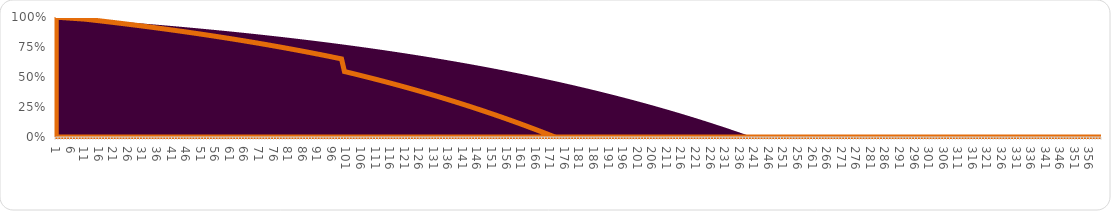
| Category | Original Loan | Effect of Extra Payments |
|---|---|---|
| 0 | 0.998 | 0.998 |
| 1 | 0.997 | 0.997 |
| 2 | 0.995 | 0.995 |
| 3 | 0.994 | 0.994 |
| 4 | 0.992 | 0.992 |
| 5 | 0.99 | 0.99 |
| 6 | 0.989 | 0.989 |
| 7 | 0.987 | 0.987 |
| 8 | 0.985 | 0.985 |
| 9 | 0.984 | 0.984 |
| 10 | 0.982 | 0.982 |
| 11 | 0.98 | 0.979 |
| 12 | 0.978 | 0.976 |
| 13 | 0.977 | 0.974 |
| 14 | 0.975 | 0.971 |
| 15 | 0.973 | 0.968 |
| 16 | 0.971 | 0.965 |
| 17 | 0.969 | 0.962 |
| 18 | 0.968 | 0.959 |
| 19 | 0.966 | 0.957 |
| 20 | 0.964 | 0.954 |
| 21 | 0.962 | 0.951 |
| 22 | 0.96 | 0.948 |
| 23 | 0.958 | 0.945 |
| 24 | 0.957 | 0.942 |
| 25 | 0.955 | 0.939 |
| 26 | 0.953 | 0.936 |
| 27 | 0.951 | 0.933 |
| 28 | 0.949 | 0.93 |
| 29 | 0.947 | 0.927 |
| 30 | 0.945 | 0.924 |
| 31 | 0.943 | 0.92 |
| 32 | 0.941 | 0.917 |
| 33 | 0.939 | 0.914 |
| 34 | 0.937 | 0.911 |
| 35 | 0.935 | 0.908 |
| 36 | 0.933 | 0.904 |
| 37 | 0.931 | 0.901 |
| 38 | 0.929 | 0.898 |
| 39 | 0.927 | 0.894 |
| 40 | 0.924 | 0.891 |
| 41 | 0.922 | 0.888 |
| 42 | 0.92 | 0.884 |
| 43 | 0.918 | 0.881 |
| 44 | 0.916 | 0.878 |
| 45 | 0.914 | 0.874 |
| 46 | 0.911 | 0.871 |
| 47 | 0.909 | 0.867 |
| 48 | 0.907 | 0.864 |
| 49 | 0.905 | 0.86 |
| 50 | 0.902 | 0.856 |
| 51 | 0.9 | 0.853 |
| 52 | 0.898 | 0.849 |
| 53 | 0.896 | 0.845 |
| 54 | 0.893 | 0.842 |
| 55 | 0.891 | 0.838 |
| 56 | 0.888 | 0.834 |
| 57 | 0.886 | 0.831 |
| 58 | 0.884 | 0.827 |
| 59 | 0.881 | 0.823 |
| 60 | 0.879 | 0.819 |
| 61 | 0.876 | 0.815 |
| 62 | 0.874 | 0.811 |
| 63 | 0.871 | 0.807 |
| 64 | 0.869 | 0.803 |
| 65 | 0.866 | 0.799 |
| 66 | 0.864 | 0.795 |
| 67 | 0.861 | 0.791 |
| 68 | 0.859 | 0.787 |
| 69 | 0.856 | 0.783 |
| 70 | 0.854 | 0.779 |
| 71 | 0.851 | 0.775 |
| 72 | 0.848 | 0.771 |
| 73 | 0.846 | 0.766 |
| 74 | 0.843 | 0.762 |
| 75 | 0.84 | 0.758 |
| 76 | 0.837 | 0.754 |
| 77 | 0.835 | 0.749 |
| 78 | 0.832 | 0.745 |
| 79 | 0.829 | 0.741 |
| 80 | 0.826 | 0.736 |
| 81 | 0.824 | 0.732 |
| 82 | 0.821 | 0.727 |
| 83 | 0.818 | 0.723 |
| 84 | 0.815 | 0.718 |
| 85 | 0.812 | 0.713 |
| 86 | 0.809 | 0.709 |
| 87 | 0.806 | 0.704 |
| 88 | 0.803 | 0.7 |
| 89 | 0.8 | 0.695 |
| 90 | 0.797 | 0.69 |
| 91 | 0.794 | 0.685 |
| 92 | 0.791 | 0.68 |
| 93 | 0.788 | 0.676 |
| 94 | 0.785 | 0.671 |
| 95 | 0.782 | 0.666 |
| 96 | 0.779 | 0.661 |
| 97 | 0.775 | 0.656 |
| 98 | 0.772 | 0.651 |
| 99 | 0.769 | 0.546 |
| 100 | 0.766 | 0.54 |
| 101 | 0.763 | 0.534 |
| 102 | 0.759 | 0.528 |
| 103 | 0.756 | 0.522 |
| 104 | 0.753 | 0.516 |
| 105 | 0.749 | 0.51 |
| 106 | 0.746 | 0.504 |
| 107 | 0.743 | 0.498 |
| 108 | 0.739 | 0.492 |
| 109 | 0.736 | 0.486 |
| 110 | 0.732 | 0.479 |
| 111 | 0.729 | 0.473 |
| 112 | 0.725 | 0.467 |
| 113 | 0.722 | 0.46 |
| 114 | 0.718 | 0.454 |
| 115 | 0.715 | 0.448 |
| 116 | 0.711 | 0.441 |
| 117 | 0.707 | 0.434 |
| 118 | 0.704 | 0.428 |
| 119 | 0.7 | 0.421 |
| 120 | 0.696 | 0.415 |
| 121 | 0.692 | 0.408 |
| 122 | 0.689 | 0.401 |
| 123 | 0.685 | 0.394 |
| 124 | 0.681 | 0.387 |
| 125 | 0.677 | 0.38 |
| 126 | 0.673 | 0.373 |
| 127 | 0.669 | 0.366 |
| 128 | 0.665 | 0.359 |
| 129 | 0.662 | 0.352 |
| 130 | 0.658 | 0.345 |
| 131 | 0.654 | 0.338 |
| 132 | 0.649 | 0.33 |
| 133 | 0.645 | 0.323 |
| 134 | 0.641 | 0.316 |
| 135 | 0.637 | 0.308 |
| 136 | 0.633 | 0.301 |
| 137 | 0.629 | 0.293 |
| 138 | 0.625 | 0.286 |
| 139 | 0.62 | 0.278 |
| 140 | 0.616 | 0.27 |
| 141 | 0.612 | 0.262 |
| 142 | 0.607 | 0.255 |
| 143 | 0.603 | 0.247 |
| 144 | 0.599 | 0.239 |
| 145 | 0.594 | 0.231 |
| 146 | 0.59 | 0.223 |
| 147 | 0.585 | 0.215 |
| 148 | 0.581 | 0.207 |
| 149 | 0.576 | 0.198 |
| 150 | 0.571 | 0.19 |
| 151 | 0.567 | 0.182 |
| 152 | 0.562 | 0.173 |
| 153 | 0.557 | 0.165 |
| 154 | 0.553 | 0.156 |
| 155 | 0.548 | 0.148 |
| 156 | 0.543 | 0.139 |
| 157 | 0.538 | 0.13 |
| 158 | 0.533 | 0.122 |
| 159 | 0.529 | 0.113 |
| 160 | 0.524 | 0.104 |
| 161 | 0.519 | 0.095 |
| 162 | 0.514 | 0.086 |
| 163 | 0.509 | 0.077 |
| 164 | 0.504 | 0.068 |
| 165 | 0.498 | 0.059 |
| 166 | 0.493 | 0.049 |
| 167 | 0.488 | 0.04 |
| 168 | 0.483 | 0.031 |
| 169 | 0.478 | 0.021 |
| 170 | 0.472 | 0.012 |
| 171 | 0.467 | 0.002 |
| 172 | 0.462 | 0 |
| 173 | 0.456 | 0 |
| 174 | 0.451 | 0 |
| 175 | 0.445 | 0 |
| 176 | 0.44 | 0 |
| 177 | 0.434 | 0 |
| 178 | 0.429 | 0 |
| 179 | 0.423 | 0 |
| 180 | 0.417 | 0 |
| 181 | 0.412 | 0 |
| 182 | 0.406 | 0 |
| 183 | 0.4 | 0 |
| 184 | 0.394 | 0 |
| 185 | 0.388 | 0 |
| 186 | 0.382 | 0 |
| 187 | 0.376 | 0 |
| 188 | 0.37 | 0 |
| 189 | 0.364 | 0 |
| 190 | 0.358 | 0 |
| 191 | 0.352 | 0 |
| 192 | 0.346 | 0 |
| 193 | 0.34 | 0 |
| 194 | 0.333 | 0 |
| 195 | 0.327 | 0 |
| 196 | 0.321 | 0 |
| 197 | 0.314 | 0 |
| 198 | 0.308 | 0 |
| 199 | 0.301 | 0 |
| 200 | 0.295 | 0 |
| 201 | 0.288 | 0 |
| 202 | 0.282 | 0 |
| 203 | 0.275 | 0 |
| 204 | 0.268 | 0 |
| 205 | 0.261 | 0 |
| 206 | 0.255 | 0 |
| 207 | 0.248 | 0 |
| 208 | 0.241 | 0 |
| 209 | 0.234 | 0 |
| 210 | 0.227 | 0 |
| 211 | 0.22 | 0 |
| 212 | 0.213 | 0 |
| 213 | 0.205 | 0 |
| 214 | 0.198 | 0 |
| 215 | 0.191 | 0 |
| 216 | 0.184 | 0 |
| 217 | 0.176 | 0 |
| 218 | 0.169 | 0 |
| 219 | 0.161 | 0 |
| 220 | 0.154 | 0 |
| 221 | 0.146 | 0 |
| 222 | 0.139 | 0 |
| 223 | 0.131 | 0 |
| 224 | 0.123 | 0 |
| 225 | 0.115 | 0 |
| 226 | 0.107 | 0 |
| 227 | 0.099 | 0 |
| 228 | 0.092 | 0 |
| 229 | 0.083 | 0 |
| 230 | 0.075 | 0 |
| 231 | 0.067 | 0 |
| 232 | 0.059 | 0 |
| 233 | 0.051 | 0 |
| 234 | 0.042 | 0 |
| 235 | 0.034 | 0 |
| 236 | 0.026 | 0 |
| 237 | 0.017 | 0 |
| 238 | 0.009 | 0 |
| 239 | 0 | 0 |
| 240 | 0 | 0 |
| 241 | 0 | 0 |
| 242 | 0 | 0 |
| 243 | 0 | 0 |
| 244 | 0 | 0 |
| 245 | 0 | 0 |
| 246 | 0 | 0 |
| 247 | 0 | 0 |
| 248 | 0 | 0 |
| 249 | 0 | 0 |
| 250 | 0 | 0 |
| 251 | 0 | 0 |
| 252 | 0 | 0 |
| 253 | 0 | 0 |
| 254 | 0 | 0 |
| 255 | 0 | 0 |
| 256 | 0 | 0 |
| 257 | 0 | 0 |
| 258 | 0 | 0 |
| 259 | 0 | 0 |
| 260 | 0 | 0 |
| 261 | 0 | 0 |
| 262 | 0 | 0 |
| 263 | 0 | 0 |
| 264 | 0 | 0 |
| 265 | 0 | 0 |
| 266 | 0 | 0 |
| 267 | 0 | 0 |
| 268 | 0 | 0 |
| 269 | 0 | 0 |
| 270 | 0 | 0 |
| 271 | 0 | 0 |
| 272 | 0 | 0 |
| 273 | 0 | 0 |
| 274 | 0 | 0 |
| 275 | 0 | 0 |
| 276 | 0 | 0 |
| 277 | 0 | 0 |
| 278 | 0 | 0 |
| 279 | 0 | 0 |
| 280 | 0 | 0 |
| 281 | 0 | 0 |
| 282 | 0 | 0 |
| 283 | 0 | 0 |
| 284 | 0 | 0 |
| 285 | 0 | 0 |
| 286 | 0 | 0 |
| 287 | 0 | 0 |
| 288 | 0 | 0 |
| 289 | 0 | 0 |
| 290 | 0 | 0 |
| 291 | 0 | 0 |
| 292 | 0 | 0 |
| 293 | 0 | 0 |
| 294 | 0 | 0 |
| 295 | 0 | 0 |
| 296 | 0 | 0 |
| 297 | 0 | 0 |
| 298 | 0 | 0 |
| 299 | 0 | 0 |
| 300 | 0 | 0 |
| 301 | 0 | 0 |
| 302 | 0 | 0 |
| 303 | 0 | 0 |
| 304 | 0 | 0 |
| 305 | 0 | 0 |
| 306 | 0 | 0 |
| 307 | 0 | 0 |
| 308 | 0 | 0 |
| 309 | 0 | 0 |
| 310 | 0 | 0 |
| 311 | 0 | 0 |
| 312 | 0 | 0 |
| 313 | 0 | 0 |
| 314 | 0 | 0 |
| 315 | 0 | 0 |
| 316 | 0 | 0 |
| 317 | 0 | 0 |
| 318 | 0 | 0 |
| 319 | 0 | 0 |
| 320 | 0 | 0 |
| 321 | 0 | 0 |
| 322 | 0 | 0 |
| 323 | 0 | 0 |
| 324 | 0 | 0 |
| 325 | 0 | 0 |
| 326 | 0 | 0 |
| 327 | 0 | 0 |
| 328 | 0 | 0 |
| 329 | 0 | 0 |
| 330 | 0 | 0 |
| 331 | 0 | 0 |
| 332 | 0 | 0 |
| 333 | 0 | 0 |
| 334 | 0 | 0 |
| 335 | 0 | 0 |
| 336 | 0 | 0 |
| 337 | 0 | 0 |
| 338 | 0 | 0 |
| 339 | 0 | 0 |
| 340 | 0 | 0 |
| 341 | 0 | 0 |
| 342 | 0 | 0 |
| 343 | 0 | 0 |
| 344 | 0 | 0 |
| 345 | 0 | 0 |
| 346 | 0 | 0 |
| 347 | 0 | 0 |
| 348 | 0 | 0 |
| 349 | 0 | 0 |
| 350 | 0 | 0 |
| 351 | 0 | 0 |
| 352 | 0 | 0 |
| 353 | 0 | 0 |
| 354 | 0 | 0 |
| 355 | 0 | 0 |
| 356 | 0 | 0 |
| 357 | 0 | 0 |
| 358 | 0 | 0 |
| 359 | 0 | 0 |